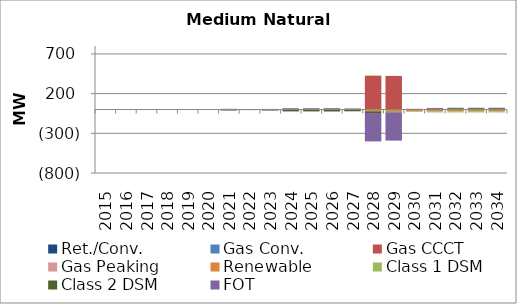
| Category | Ret./Conv. | Gas Conv. | Gas CCCT | Gas Peaking | Renewable | Class 1 DSM | Class 2 DSM | FOT |
|---|---|---|---|---|---|---|---|---|
| 2015.0 | 0 | 0 | 0 | 0 | 0 | 0 | -0.15 | 0.124 |
| 2016.0 | 0 | 0 | 0 | 0 | 0 | 0 | -0.31 | 0.204 |
| 2017.0 | 0 | 0 | 0 | 0 | 0 | 0 | -0.57 | 0.359 |
| 2018.0 | 0 | 0 | 0 | 0 | 0 | 0 | -1 | 0.54 |
| 2019.0 | 0 | 0 | 0 | 0 | 0 | 0 | -3.25 | -0.073 |
| 2020.0 | 0 | 0 | 0 | 0 | 0 | 0 | -3.39 | -0.491 |
| 2021.0 | 0 | 0 | 0 | 0 | 0 | -7.45 | -6.59 | 8.538 |
| 2022.0 | 0 | 0 | 0 | 0 | 0 | 3.1 | -7.27 | -0.736 |
| 2023.0 | 0 | 0 | 0 | 0 | 0 | -0.3 | -13.14 | 7.361 |
| 2024.0 | 0 | 0 | 0 | 0 | 0 | -4.03 | -20.2 | 16.498 |
| 2025.0 | 0 | 0 | 0 | 0 | 0 | -4.03 | -20.18 | 16.495 |
| 2026.0 | 0 | 0 | 0 | 0 | 0 | -4.03 | -21.34 | 17.184 |
| 2027.0 | 0 | 0 | 0 | 0 | 0 | 6.57 | -22.66 | 7.362 |
| 2028.0 | 0 | 0 | 423 | 0 | -22 | 6.57 | -22.56 | -357.187 |
| 2029.0 | 0 | 0 | 423 | 0 | -22 | -3.98 | -12.3 | -353.645 |
| 2030.0 | 0 | 0 | 0 | 0 | -22 | -3.98 | -2.07 | 8.834 |
| 2031.0 | 0 | 0 | 0 | 0 | -22 | -14.58 | 6.97 | 12.738 |
| 2032.0 | 0 | 0 | 0 | 0 | -22 | -14.58 | 16.56 | 5.726 |
| 2033.0 | 0 | 0 | 0 | 0 | -22 | -14.58 | 16.64 | 5.667 |
| 2034.0 | 0 | 0 | 0 | 0 | -22 | -14.58 | 16.83 | 5.541 |